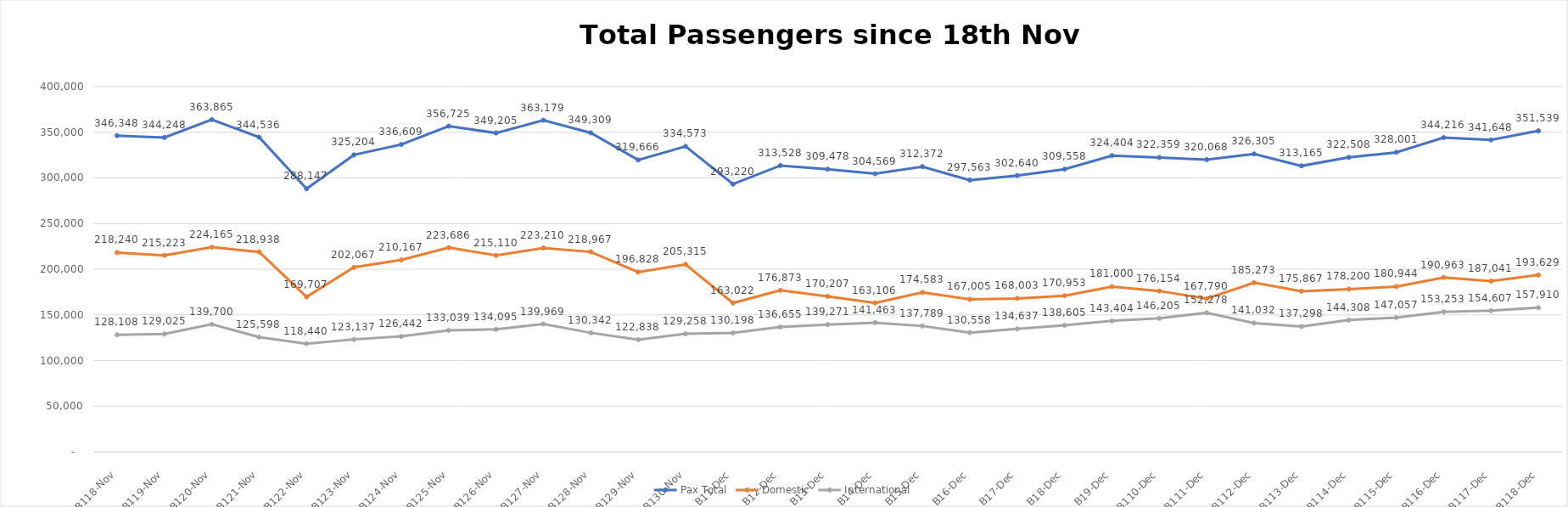
| Category | Pax Total |  Domestic  |  International  |
|---|---|---|---|
| 2022-11-18 | 346348 | 218240 | 128108 |
| 2022-11-19 | 344248 | 215223 | 129025 |
| 2022-11-20 | 363865 | 224165 | 139700 |
| 2022-11-21 | 344536 | 218938 | 125598 |
| 2022-11-22 | 288147 | 169707 | 118440 |
| 2022-11-23 | 325204 | 202067 | 123137 |
| 2022-11-24 | 336609 | 210167 | 126442 |
| 2022-11-25 | 356725 | 223686 | 133039 |
| 2022-11-26 | 349205 | 215110 | 134095 |
| 2022-11-27 | 363179 | 223210 | 139969 |
| 2022-11-28 | 349309 | 218967 | 130342 |
| 2022-11-29 | 319666 | 196828 | 122838 |
| 2022-11-30 | 334573 | 205315 | 129258 |
| 2022-12-01 | 293220 | 163022 | 130198 |
| 2022-12-02 | 313528 | 176873 | 136655 |
| 2022-12-03 | 309478 | 170207 | 139271 |
| 2022-12-04 | 304569 | 163106 | 141463 |
| 2022-12-05 | 312372 | 174583 | 137789 |
| 2022-12-06 | 297563 | 167005 | 130558 |
| 2022-12-07 | 302640 | 168003 | 134637 |
| 2022-12-08 | 309558 | 170953 | 138605 |
| 2022-12-09 | 324404 | 181000 | 143404 |
| 2022-12-10 | 322359 | 176154 | 146205 |
| 2022-12-11 | 320068 | 167790 | 152278 |
| 2022-12-12 | 326305 | 185273 | 141032 |
| 2022-12-13 | 313165 | 175867 | 137298 |
| 2022-12-14 | 322508 | 178200 | 144308 |
| 2022-12-15 | 328001 | 180944 | 147057 |
| 2022-12-16 | 344216 | 190963 | 153253 |
| 2022-12-17 | 341648 | 187041 | 154607 |
| 2022-12-18 | 351539 | 193629 | 157910 |